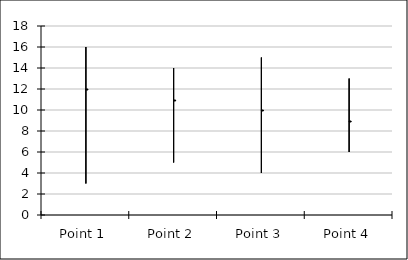
| Category | High | Low | Close |
|---|---|---|---|
| Point 1 | 16 | 3 | 12 |
| Point 2 | 14 | 5 | 11 |
| Point 3 | 15 | 4 | 10 |
| Point 4 | 13 | 6 | 9 |